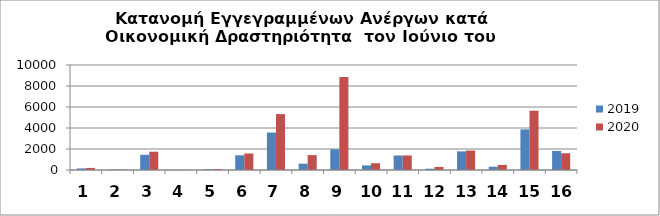
| Category | 2019 | 2020 |
|---|---|---|
| 0 | 150 | 198 |
| 1 | 31 | 41 |
| 2 | 1449 | 1742 |
| 3 | 10 | 15 |
| 4 | 70 | 96 |
| 5 | 1401 | 1573 |
| 6 | 3564 | 5321 |
| 7 | 600 | 1420 |
| 8 | 1972 | 8852 |
| 9 | 438 | 645 |
| 10 | 1378 | 1384 |
| 11 | 124 | 294 |
| 12 | 1777 | 1854 |
| 13 | 314 | 482 |
| 14 | 3869 | 5647 |
| 15 | 1813 | 1594 |